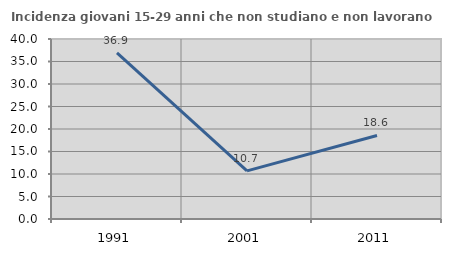
| Category | Incidenza giovani 15-29 anni che non studiano e non lavorano  |
|---|---|
| 1991.0 | 36.905 |
| 2001.0 | 10.7 |
| 2011.0 | 18.557 |